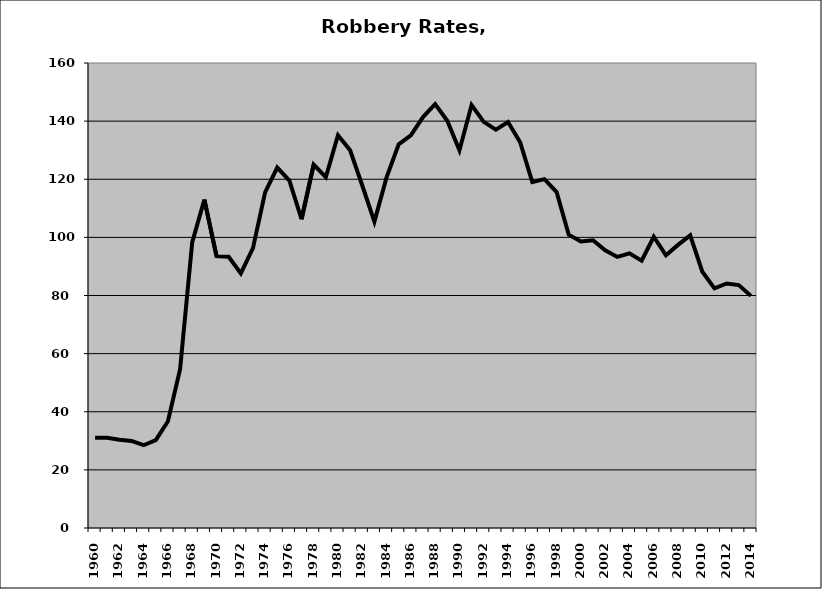
| Category | Robbery |
|---|---|
| 1960.0 | 31.053 |
| 1961.0 | 31.082 |
| 1962.0 | 30.339 |
| 1963.0 | 29.967 |
| 1964.0 | 28.485 |
| 1965.0 | 30.268 |
| 1966.0 | 36.711 |
| 1967.0 | 54.616 |
| 1968.0 | 98.382 |
| 1969.0 | 112.992 |
| 1970.0 | 93.542 |
| 1971.0 | 93.331 |
| 1972.0 | 87.598 |
| 1973.0 | 96.296 |
| 1974.0 | 115.506 |
| 1975.0 | 124.012 |
| 1976.0 | 119.518 |
| 1977.0 | 106.233 |
| 1978.0 | 125.04 |
| 1979.0 | 120.708 |
| 1980.0 | 135.122 |
| 1981.0 | 129.986 |
| 1982.0 | 117.856 |
| 1983.0 | 105.419 |
| 1984.0 | 120.648 |
| 1985.0 | 132.025 |
| 1986.0 | 135.133 |
| 1987.0 | 141.406 |
| 1988.0 | 145.876 |
| 1989.0 | 140.139 |
| 1990.0 | 129.986 |
| 1991.0 | 145.536 |
| 1992.0 | 139.759 |
| 1993.0 | 137.088 |
| 1994.0 | 139.697 |
| 1995.0 | 132.738 |
| 1996.0 | 119.049 |
| 1997.0 | 120.036 |
| 1998.0 | 115.609 |
| 1999.0 | 100.897 |
| 2000.0 | 98.607 |
| 2001.0 | 99.009 |
| 2002.0 | 95.549 |
| 2003.0 | 93.259 |
| 2004.0 | 94.506 |
| 2005.0 | 91.991 |
| 2006.0 | 100.222 |
| 2007.0 | 93.84 |
| 2008.0 | 97.425 |
| 2009.0 | 100.702 |
| 2010.0 | 88.17 |
| 2011.0 | 82.468 |
| 2012.0 | 84.13 |
| 2013.0 | 83.585 |
| 2014.0 | 79.869 |